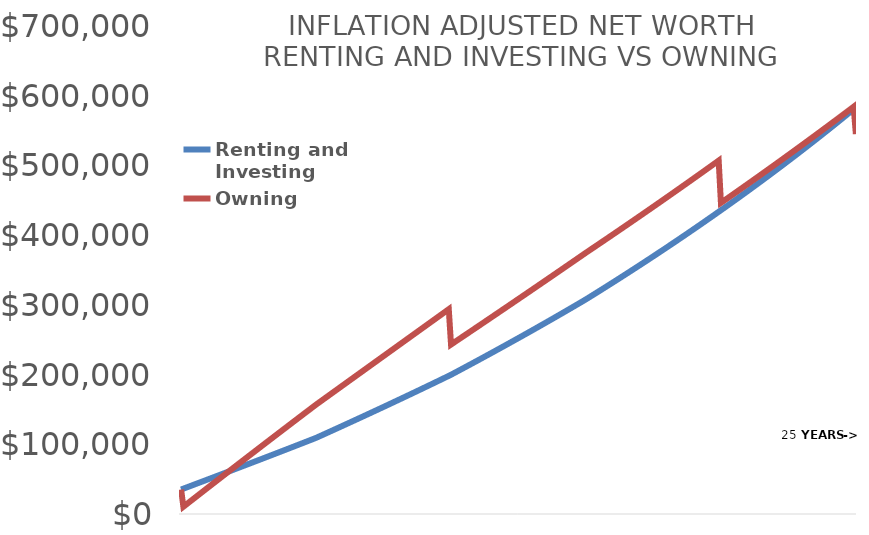
| Category | Renting and Investing | Owning |
|---|---|---|
| 0.0 | 35143 | 35143 |
| 1.0 | 36348.884 | 10424.443 |
| 2.0 | 37563.11 | 12947.386 |
| 3.0 | 38777.814 | 15468.836 |
| 4.0 | 39993.008 | 17988.796 |
| 5.0 | 41208.703 | 20507.273 |
| 6.0 | 42424.912 | 23024.271 |
| 7.0 | 43641.647 | 25539.797 |
| 8.0 | 44858.919 | 28053.855 |
| 9.0 | 46076.741 | 30566.451 |
| 10.0 | 47295.125 | 33077.59 |
| 11.0 | 48514.083 | 35587.278 |
| 12.0 | 49733.628 | 38095.52 |
| 13.0 | 50953.77 | 40602.32 |
| 14.0 | 52174.524 | 43107.685 |
| 15.0 | 53395.9 | 45611.62 |
| 16.0 | 54617.91 | 48114.129 |
| 17.0 | 55840.569 | 50615.219 |
| 18.0 | 57063.886 | 53114.894 |
| 19.0 | 58287.876 | 55613.16 |
| 20.0 | 59512.549 | 58110.022 |
| 21.0 | 60737.919 | 60605.485 |
| 22.0 | 61963.998 | 63099.555 |
| 23.0 | 63190.799 | 65592.237 |
| 24.0 | 64418.333 | 68083.536 |
| 25.0 | 65646.613 | 70573.457 |
| 26.0 | 66875.652 | 73062.006 |
| 27.0 | 68105.462 | 75549.187 |
| 28.0 | 69336.056 | 78035.006 |
| 29.0 | 70567.446 | 80519.469 |
| 30.0 | 71799.645 | 83002.58 |
| 31.0 | 73032.666 | 85484.345 |
| 32.0 | 74266.521 | 87964.768 |
| 33.0 | 75501.222 | 90443.856 |
| 34.0 | 76736.783 | 92921.612 |
| 35.0 | 77973.216 | 95398.043 |
| 36.0 | 79210.535 | 97873.154 |
| 37.0 | 80448.751 | 100346.949 |
| 38.0 | 81687.877 | 102819.435 |
| 39.0 | 82927.927 | 105290.615 |
| 40.0 | 84168.913 | 107760.496 |
| 41.0 | 85410.848 | 110229.082 |
| 42.0 | 86653.746 | 112696.379 |
| 43.0 | 87897.618 | 115162.391 |
| 44.0 | 89142.478 | 117627.124 |
| 45.0 | 90388.339 | 120090.583 |
| 46.0 | 91635.214 | 122552.774 |
| 47.0 | 92883.116 | 125013.7 |
| 48.0 | 94132.058 | 127473.368 |
| 49.0 | 95382.053 | 129931.782 |
| 50.0 | 96633.115 | 132388.948 |
| 51.0 | 97885.256 | 134844.871 |
| 52.0 | 99138.49 | 137299.555 |
| 53.0 | 100392.83 | 139753.006 |
| 54.0 | 101648.288 | 142205.23 |
| 55.0 | 102904.88 | 144656.23 |
| 56.0 | 104162.617 | 147106.012 |
| 57.0 | 105421.513 | 149554.582 |
| 58.0 | 106681.581 | 152001.944 |
| 59.0 | 107942.836 | 154448.103 |
| 60.0 | 109205.289 | 156893.064 |
| 61.0 | 110662.153 | 159216.802 |
| 62.0 | 112120.48 | 161540.304 |
| 63.0 | 113580.283 | 163863.576 |
| 64.0 | 115041.58 | 166186.623 |
| 65.0 | 116504.384 | 168509.45 |
| 66.0 | 117968.712 | 170832.063 |
| 67.0 | 119434.579 | 173154.469 |
| 68.0 | 120902 | 175476.671 |
| 69.0 | 122370.991 | 177798.676 |
| 70.0 | 123841.567 | 180120.489 |
| 71.0 | 125313.744 | 182442.116 |
| 72.0 | 126787.538 | 184763.562 |
| 73.0 | 128262.964 | 187084.832 |
| 74.0 | 129740.037 | 189405.933 |
| 75.0 | 131218.774 | 191726.869 |
| 76.0 | 132699.19 | 194047.647 |
| 77.0 | 134181.302 | 196368.271 |
| 78.0 | 135665.124 | 198688.747 |
| 79.0 | 137150.673 | 201009.081 |
| 80.0 | 138637.964 | 203329.278 |
| 81.0 | 140127.014 | 205649.344 |
| 82.0 | 141617.838 | 207969.283 |
| 83.0 | 143110.453 | 210289.103 |
| 84.0 | 144604.874 | 212608.807 |
| 85.0 | 146101.118 | 214928.401 |
| 86.0 | 147599.2 | 217247.892 |
| 87.0 | 149099.138 | 219567.284 |
| 88.0 | 150600.946 | 221886.583 |
| 89.0 | 152104.642 | 224205.795 |
| 90.0 | 153610.241 | 226524.924 |
| 91.0 | 155117.76 | 228843.977 |
| 92.0 | 156627.216 | 231162.958 |
| 93.0 | 158138.624 | 233481.874 |
| 94.0 | 159652.001 | 235800.73 |
| 95.0 | 161167.363 | 238119.531 |
| 96.0 | 162684.728 | 240438.282 |
| 97.0 | 164204.111 | 242756.99 |
| 98.0 | 165725.53 | 245075.659 |
| 99.0 | 167249 | 247394.296 |
| 100.0 | 168774.539 | 249712.905 |
| 101.0 | 170302.163 | 252031.492 |
| 102.0 | 171831.889 | 254350.062 |
| 103.0 | 173363.734 | 256668.622 |
| 104.0 | 174897.714 | 258987.176 |
| 105.0 | 176433.847 | 261305.729 |
| 106.0 | 177972.15 | 263624.288 |
| 107.0 | 179512.639 | 265942.858 |
| 108.0 | 181055.331 | 268261.444 |
| 109.0 | 182600.244 | 270580.052 |
| 110.0 | 184147.394 | 272898.686 |
| 111.0 | 185696.799 | 275217.354 |
| 112.0 | 187248.476 | 277536.059 |
| 113.0 | 188802.442 | 279854.808 |
| 114.0 | 190358.715 | 282173.605 |
| 115.0 | 191917.311 | 284492.457 |
| 116.0 | 193478.248 | 286811.369 |
| 117.0 | 195041.544 | 289130.346 |
| 118.0 | 196607.216 | 291449.394 |
| 119.0 | 198175.281 | 293768.518 |
| 120.0 | 199745.757 | 243102.395 |
| 121.0 | 201460.528 | 245267.732 |
| 122.0 | 203177.918 | 247433.95 |
| 123.0 | 204897.947 | 249601.053 |
| 124.0 | 206620.632 | 251769.05 |
| 125.0 | 208345.995 | 253937.948 |
| 126.0 | 210074.052 | 256107.754 |
| 127.0 | 211804.825 | 258278.476 |
| 128.0 | 213538.331 | 260450.12 |
| 129.0 | 215274.591 | 262622.694 |
| 130.0 | 217013.622 | 264796.205 |
| 131.0 | 218755.446 | 266970.661 |
| 132.0 | 220500.081 | 269146.069 |
| 133.0 | 222247.547 | 271322.436 |
| 134.0 | 223997.863 | 273499.769 |
| 135.0 | 225751.048 | 275678.076 |
| 136.0 | 227507.123 | 277857.364 |
| 137.0 | 229266.107 | 280037.641 |
| 138.0 | 231028.02 | 282218.913 |
| 139.0 | 232792.881 | 284401.189 |
| 140.0 | 234560.71 | 286584.474 |
| 141.0 | 236331.528 | 288768.778 |
| 142.0 | 238105.354 | 290954.107 |
| 143.0 | 239882.207 | 293140.469 |
| 144.0 | 241662.109 | 295327.871 |
| 145.0 | 243445.079 | 297516.32 |
| 146.0 | 245231.138 | 299705.823 |
| 147.0 | 247020.304 | 301896.389 |
| 148.0 | 248812.6 | 304088.025 |
| 149.0 | 250608.045 | 306280.738 |
| 150.0 | 252406.659 | 308474.535 |
| 151.0 | 254208.462 | 310669.424 |
| 152.0 | 256013.476 | 312865.412 |
| 153.0 | 257821.721 | 315062.507 |
| 154.0 | 259633.217 | 317260.717 |
| 155.0 | 261447.985 | 319460.048 |
| 156.0 | 263266.046 | 321660.508 |
| 157.0 | 265087.42 | 323862.105 |
| 158.0 | 266912.128 | 326064.846 |
| 159.0 | 268740.191 | 328268.739 |
| 160.0 | 270571.63 | 330473.792 |
| 161.0 | 272406.466 | 332680.01 |
| 162.0 | 274244.72 | 334887.404 |
| 163.0 | 276086.413 | 337095.978 |
| 164.0 | 277931.566 | 339305.743 |
| 165.0 | 279780.2 | 341516.704 |
| 166.0 | 281632.337 | 343728.869 |
| 167.0 | 283487.998 | 345942.247 |
| 168.0 | 285347.204 | 348156.844 |
| 169.0 | 287209.976 | 350372.668 |
| 170.0 | 289076.337 | 352589.727 |
| 171.0 | 290946.307 | 354808.028 |
| 172.0 | 292819.909 | 357027.579 |
| 173.0 | 294697.164 | 359248.388 |
| 174.0 | 296578.093 | 361470.462 |
| 175.0 | 298462.719 | 363693.808 |
| 176.0 | 300351.063 | 365918.435 |
| 177.0 | 302243.147 | 368144.351 |
| 178.0 | 304138.993 | 370371.562 |
| 179.0 | 306038.624 | 372600.076 |
| 180.0 | 307942.061 | 374829.901 |
| 181.0 | 309941.734 | 376998.049 |
| 182.0 | 311945.37 | 379168.42 |
| 183.0 | 313952.994 | 381341.026 |
| 184.0 | 315964.626 | 383515.876 |
| 185.0 | 317980.292 | 385692.984 |
| 186.0 | 320000.014 | 387872.36 |
| 187.0 | 322023.816 | 390054.015 |
| 188.0 | 324051.721 | 392237.962 |
| 189.0 | 326083.753 | 394424.211 |
| 190.0 | 328119.935 | 396612.774 |
| 191.0 | 330160.291 | 398803.662 |
| 192.0 | 332204.844 | 400996.887 |
| 193.0 | 334253.619 | 403192.461 |
| 194.0 | 336306.639 | 405390.395 |
| 195.0 | 338363.927 | 407590.701 |
| 196.0 | 340425.509 | 409793.39 |
| 197.0 | 342491.408 | 411998.474 |
| 198.0 | 344561.649 | 414205.965 |
| 199.0 | 346636.254 | 416415.874 |
| 200.0 | 348715.249 | 418628.213 |
| 201.0 | 350798.658 | 420842.994 |
| 202.0 | 352886.506 | 423060.229 |
| 203.0 | 354978.816 | 425279.929 |
| 204.0 | 357075.613 | 427502.106 |
| 205.0 | 359176.923 | 429726.773 |
| 206.0 | 361282.768 | 431953.941 |
| 207.0 | 363393.176 | 434183.621 |
| 208.0 | 365508.169 | 436415.827 |
| 209.0 | 367627.773 | 438650.57 |
| 210.0 | 369752.013 | 440887.862 |
| 211.0 | 371880.914 | 443127.714 |
| 212.0 | 374014.501 | 445370.14 |
| 213.0 | 376152.799 | 447615.151 |
| 214.0 | 378295.834 | 449862.76 |
| 215.0 | 380443.631 | 452112.978 |
| 216.0 | 382596.214 | 454365.817 |
| 217.0 | 384753.61 | 456621.29 |
| 218.0 | 386915.845 | 458879.41 |
| 219.0 | 389082.943 | 461140.187 |
| 220.0 | 391254.93 | 463403.636 |
| 221.0 | 393431.833 | 465669.767 |
| 222.0 | 395613.676 | 467938.594 |
| 223.0 | 397800.487 | 470210.129 |
| 224.0 | 399992.29 | 472484.384 |
| 225.0 | 402189.112 | 474761.371 |
| 226.0 | 404390.98 | 477041.103 |
| 227.0 | 406597.918 | 479323.593 |
| 228.0 | 408809.955 | 481608.853 |
| 229.0 | 411027.115 | 483896.896 |
| 230.0 | 413249.426 | 486187.734 |
| 231.0 | 415476.913 | 488481.38 |
| 232.0 | 417709.604 | 490777.847 |
| 233.0 | 419947.525 | 493077.147 |
| 234.0 | 422190.703 | 495379.293 |
| 235.0 | 424439.165 | 497684.297 |
| 236.0 | 426692.938 | 499992.174 |
| 237.0 | 428952.048 | 502302.934 |
| 238.0 | 431216.523 | 504616.592 |
| 239.0 | 433486.39 | 506933.159 |
| 240.0 | 435761.676 | 446341.657 |
| 241.0 | 438042.409 | 448587.502 |
| 242.0 | 440328.615 | 450836.202 |
| 243.0 | 442620.323 | 453087.77 |
| 244.0 | 444917.559 | 455342.221 |
| 245.0 | 447220.352 | 457599.565 |
| 246.0 | 449528.73 | 459859.817 |
| 247.0 | 451842.719 | 462122.989 |
| 248.0 | 454162.349 | 464389.095 |
| 249.0 | 456487.646 | 466658.147 |
| 250.0 | 458818.639 | 468930.159 |
| 251.0 | 461155.357 | 471205.143 |
| 252.0 | 463497.827 | 473483.114 |
| 253.0 | 465846.077 | 475764.084 |
| 254.0 | 468200.137 | 478048.066 |
| 255.0 | 470560.034 | 480335.074 |
| 256.0 | 472925.797 | 482625.12 |
| 257.0 | 475297.455 | 484918.219 |
| 258.0 | 477675.036 | 487214.384 |
| 259.0 | 480058.57 | 489513.628 |
| 260.0 | 482448.085 | 491815.964 |
| 261.0 | 484843.611 | 494121.407 |
| 262.0 | 487245.175 | 496429.969 |
| 263.0 | 489652.808 | 498741.664 |
| 264.0 | 492066.539 | 501056.506 |
| 265.0 | 494486.397 | 503374.508 |
| 266.0 | 496912.412 | 505695.683 |
| 267.0 | 499344.613 | 508020.047 |
| 268.0 | 501783.029 | 510347.612 |
| 269.0 | 504227.691 | 512678.392 |
| 270.0 | 506678.628 | 515012.4 |
| 271.0 | 509135.871 | 517349.652 |
| 272.0 | 511599.448 | 519690.16 |
| 273.0 | 514069.391 | 522033.938 |
| 274.0 | 516545.729 | 524381.001 |
| 275.0 | 519028.493 | 526731.361 |
| 276.0 | 521517.712 | 529085.035 |
| 277.0 | 524013.418 | 531442.034 |
| 278.0 | 526515.641 | 533802.374 |
| 279.0 | 529024.412 | 536166.069 |
| 280.0 | 531539.761 | 538533.132 |
| 281.0 | 534061.719 | 540903.578 |
| 282.0 | 536590.317 | 543277.421 |
| 283.0 | 539125.587 | 545654.675 |
| 284.0 | 541667.558 | 548035.355 |
| 285.0 | 544216.263 | 550419.474 |
| 286.0 | 546771.732 | 552807.048 |
| 287.0 | 549333.998 | 555198.091 |
| 288.0 | 551903.091 | 557592.616 |
| 289.0 | 554479.044 | 559990.64 |
| 290.0 | 557061.887 | 562392.175 |
| 291.0 | 559651.653 | 564797.237 |
| 292.0 | 562248.373 | 567205.84 |
| 293.0 | 564852.08 | 569617.999 |
| 294.0 | 567462.806 | 572033.728 |
| 295.0 | 570080.582 | 574453.042 |
| 296.0 | 572705.441 | 576875.957 |
| 297.0 | 575337.416 | 579302.486 |
| 298.0 | 577976.539 | 581732.644 |
| 299.0 | 580622.842 | 584166.447 |
| 300.0 | 582964.979 | 544910.61 |